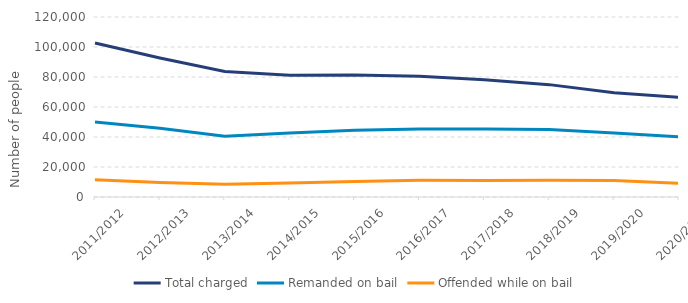
| Category | Total charged | Remanded on bail | Offended while on bail |
|---|---|---|---|
| 2011/2012 | 102706 | 50038 | 11539 |
| 2012/2013 | 92675 | 45809 | 9722 |
| 2013/2014 | 83618 | 40454 | 8522 |
| 2014/2015 | 81111 | 42599 | 9346 |
| 2015/2016 | 81362 | 44505 | 10317 |
| 2016/2017 | 80522 | 45314 | 11088 |
| 2017/2018 | 78107 | 45316 | 11042 |
| 2018/2019 | 74909 | 44917 | 11180 |
| 2019/2020 | 69435 | 42686 | 11048 |
| 2020/2021 | 66458 | 40160 | 9096 |